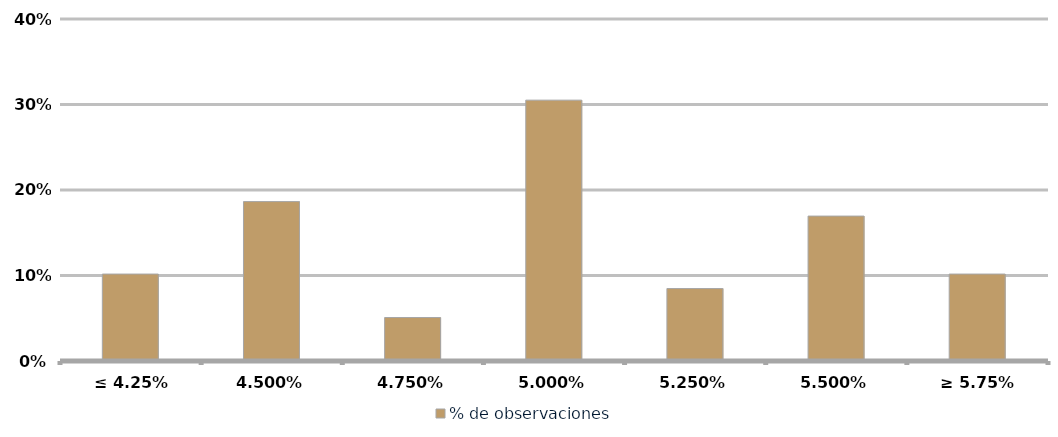
| Category | % de observaciones  |
|---|---|
| ≤ 4.25% | 0.102 |
| 4.50% | 0.186 |
| 4.75% | 0.051 |
| 5.00% | 0.305 |
| 5.25% | 0.085 |
| 5.50% | 0.169 |
| ≥ 5.75% | 0.102 |